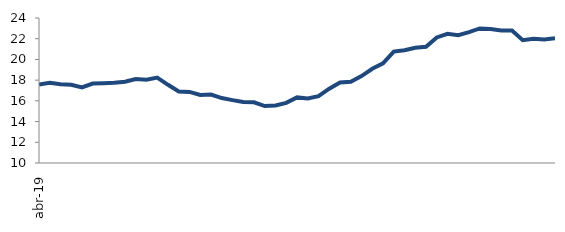
| Category | Series 0 |
|---|---|
| 2019-04-01 | 17.585 |
| 2019-05-01 | 17.752 |
| 2019-06-01 | 17.602 |
| 2019-07-01 | 17.56 |
| 2019-08-01 | 17.291 |
| 2019-09-01 | 17.666 |
| 2019-10-01 | 17.704 |
| 2019-11-01 | 17.747 |
| 2019-12-01 | 17.844 |
| 2020-01-01 | 18.099 |
| 2020-02-01 | 18.039 |
| 2020-03-01 | 18.244 |
| 2020-04-01 | 17.551 |
| 2020-05-01 | 16.911 |
| 2020-06-01 | 16.867 |
| 2020-07-01 | 16.563 |
| 2020-08-01 | 16.602 |
| 2020-09-01 | 16.272 |
| 2020-10-01 | 16.069 |
| 2020-11-01 | 15.889 |
| 2020-12-01 | 15.855 |
| 2021-01-01 | 15.501 |
| 2021-02-01 | 15.555 |
| 2021-03-01 | 15.803 |
| 2021-04-01 | 16.335 |
| 2021-05-01 | 16.232 |
| 2021-06-01 | 16.452 |
| 2021-07-01 | 17.177 |
| 2021-08-01 | 17.778 |
| 2021-09-01 | 17.842 |
| 2021-10-01 | 18.396 |
| 2021-11-01 | 19.101 |
| 2021-12-01 | 19.622 |
| 2022-01-01 | 20.759 |
| 2022-02-01 | 20.883 |
| 2022-03-01 | 21.119 |
| 2022-04-01 | 21.22 |
| 2022-05-01 | 22.124 |
| 2022-06-01 | 22.477 |
| 2022-07-01 | 22.34 |
| 2022-08-01 | 22.636 |
| 2022-09-01 | 22.99 |
| 2022-10-01 | 22.932 |
| 2022-11-01 | 22.799 |
| 2022-12-01 | 22.789 |
| 2023-01-01 | 21.858 |
| 2023-02-01 | 21.995 |
| 2023-03-01 | 21.919 |
| 2023-04-01 | 22.045 |